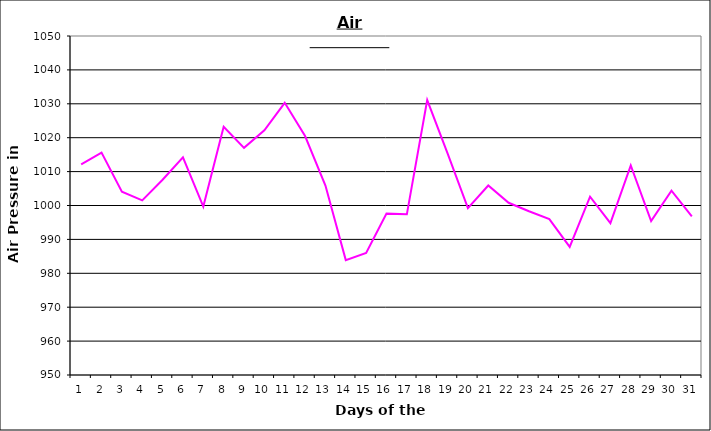
| Category | Series 0 |
|---|---|
| 0 | 1012.1 |
| 1 | 1015.6 |
| 2 | 1004.1 |
| 3 | 1001.5 |
| 4 | 1007.6 |
| 5 | 1014.2 |
| 6 | 999.7 |
| 7 | 1023.2 |
| 8 | 1017 |
| 9 | 1022.2 |
| 10 | 1030.3 |
| 11 | 1020.5 |
| 12 | 1005.9 |
| 13 | 983.9 |
| 14 | 986 |
| 15 | 997.6 |
| 16 | 997.4 |
| 17 | 1031.1 |
| 18 | 1015.4 |
| 19 | 999.2 |
| 20 | 1005.9 |
| 21 | 1000.8 |
| 22 | 998.3 |
| 23 | 996 |
| 24 | 987.8 |
| 25 | 1002.6 |
| 26 | 994.8 |
| 27 | 1011.8 |
| 28 | 995.4 |
| 29 | 1004.4 |
| 30 | 996.8 |